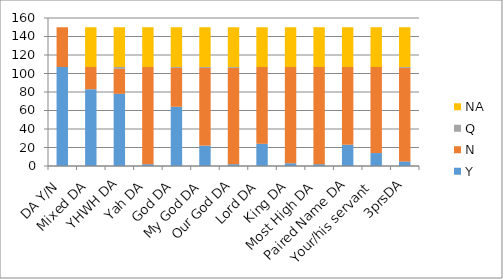
| Category | Y | N | Q | NA |
|---|---|---|---|---|
| DA Y/N | 107 | 43 | 0 | 0 |
| Mixed DA | 83 | 24 | 0 | 43 |
| YHWH DA | 78 | 27 | 2 | 43 |
| Yah DA | 2 | 105 | 0 | 43 |
| God DA | 64 | 42 | 1 | 43 |
| My God DA | 22 | 84 | 1 | 43 |
| Our God DA | 2 | 104 | 1 | 43 |
| Lord DA | 24 | 83 | 0 | 43 |
| King DA | 3 | 104 | 0 | 43 |
| Most High DA | 2 | 105 | 0 | 43 |
| Paired Name DA | 23 | 84 | 0 | 43 |
| Your/his servant | 14 | 93 | 0 | 43 |
| 3prsDA | 5 | 101 | 1 | 43 |